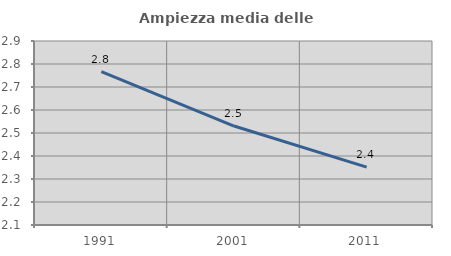
| Category | Ampiezza media delle famiglie |
|---|---|
| 1991.0 | 2.767 |
| 2001.0 | 2.53 |
| 2011.0 | 2.352 |